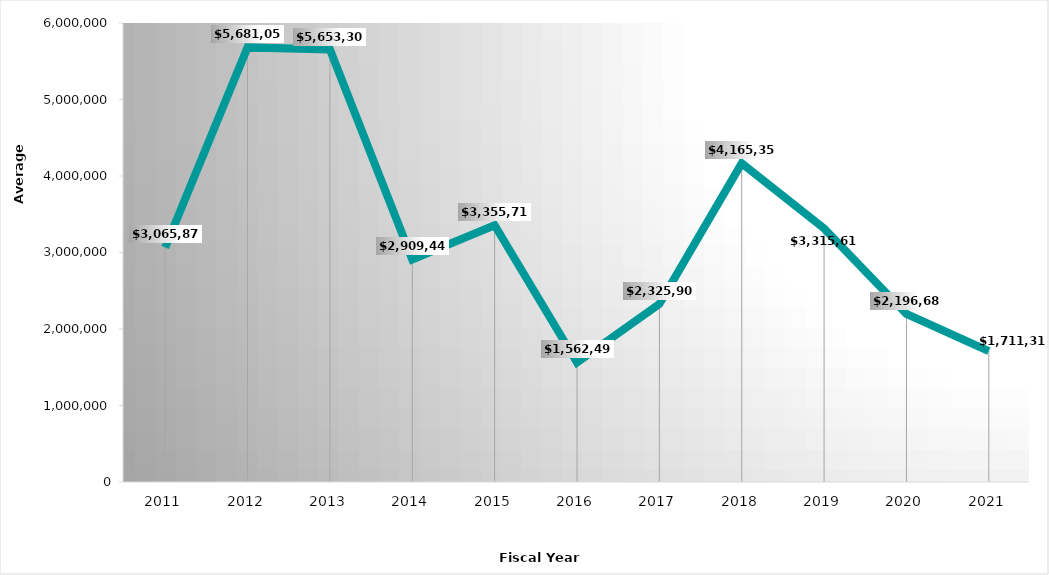
| Category | Mean |
|---|---|
| 2011.0 | 3065870 |
| 2012.0 | 5681055 |
| 2013.0 | 5653306 |
| 2014.0 | 2909446 |
| 2015.0 | 3355712 |
| 2016.0 | 1562498 |
| 2017.0 | 2325909 |
| 2018.0 | 4165355 |
| 2019.0 | 3315610 |
| 2020.0 | 2196681 |
| 2021.0 | 1711319 |